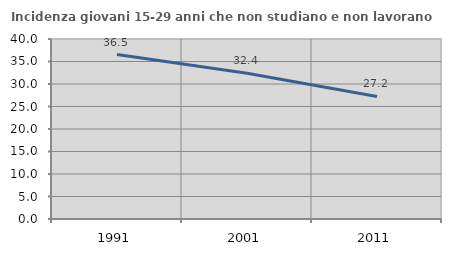
| Category | Incidenza giovani 15-29 anni che non studiano e non lavorano  |
|---|---|
| 1991.0 | 36.548 |
| 2001.0 | 32.384 |
| 2011.0 | 27.228 |